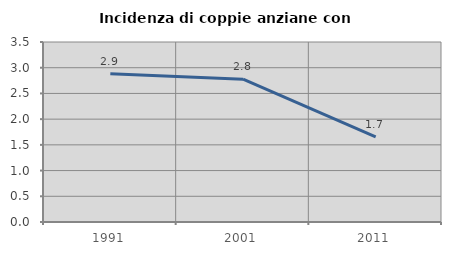
| Category | Incidenza di coppie anziane con figli |
|---|---|
| 1991.0 | 2.882 |
| 2001.0 | 2.778 |
| 2011.0 | 1.653 |